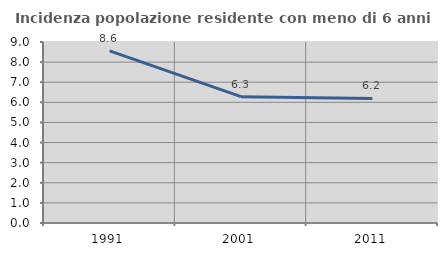
| Category | Incidenza popolazione residente con meno di 6 anni |
|---|---|
| 1991.0 | 8.555 |
| 2001.0 | 6.28 |
| 2011.0 | 6.191 |